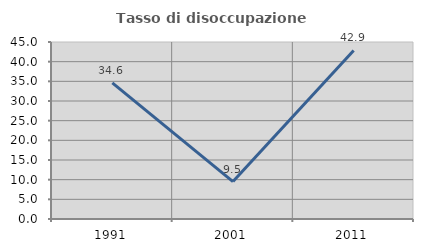
| Category | Tasso di disoccupazione giovanile  |
|---|---|
| 1991.0 | 34.615 |
| 2001.0 | 9.524 |
| 2011.0 | 42.857 |